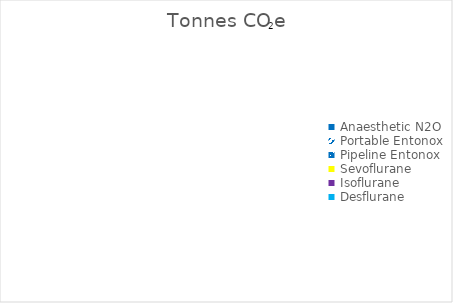
| Category | Tonnes CO2e |
|---|---|
| Anaesthetic N2O | 0 |
| Portable Entonox | 0 |
| Pipeline Entonox | 0 |
| Sevoflurane | 0 |
| Isoflurane | 0 |
| Desflurane | 0 |